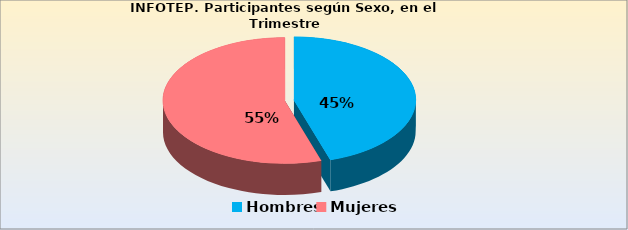
| Category | Series 0 |
|---|---|
| Hombres | 92589 |
| Mujeres | 112485 |